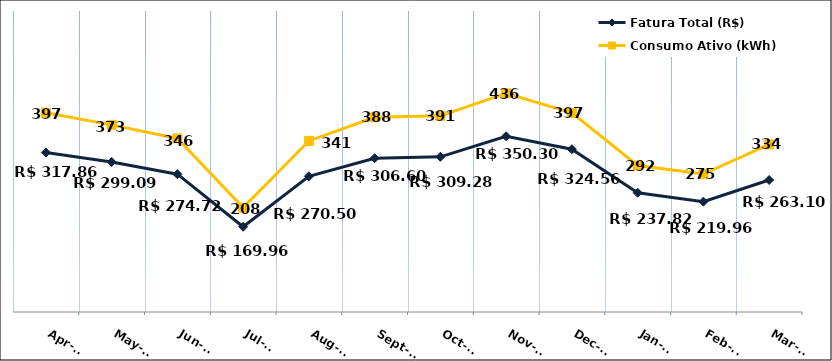
| Category | Fatura Total (R$) |
|---|---|
| 2023-04-01 | 317.86 |
| 2023-05-01 | 299.09 |
| 2023-06-01 | 274.72 |
| 2023-07-01 | 169.96 |
| 2023-08-01 | 270.5 |
| 2023-09-01 | 306.6 |
| 2023-10-01 | 309.28 |
| 2023-11-01 | 350.3 |
| 2023-12-01 | 324.56 |
| 2024-01-01 | 237.82 |
| 2024-02-01 | 219.96 |
| 2024-03-01 | 263.1 |